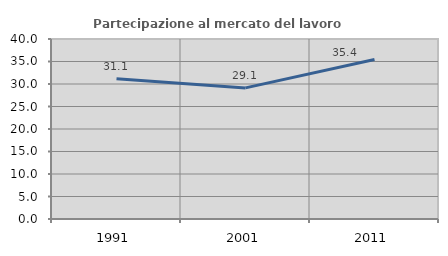
| Category | Partecipazione al mercato del lavoro  femminile |
|---|---|
| 1991.0 | 31.148 |
| 2001.0 | 29.134 |
| 2011.0 | 35.433 |